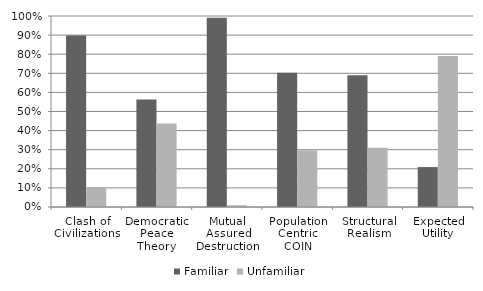
| Category | Familiar | Unfamiliar |
|---|---|---|
| Clash of Civilizations | 0.897 | 0.103 |
| Democratic Peace Theory | 0.562 | 0.438 |
| Mutual Assured Destruction | 0.991 | 0.009 |
| Population Centric COIN | 0.703 | 0.297 |
| Structural Realism | 0.689 | 0.311 |
| Expected Utility | 0.209 | 0.791 |